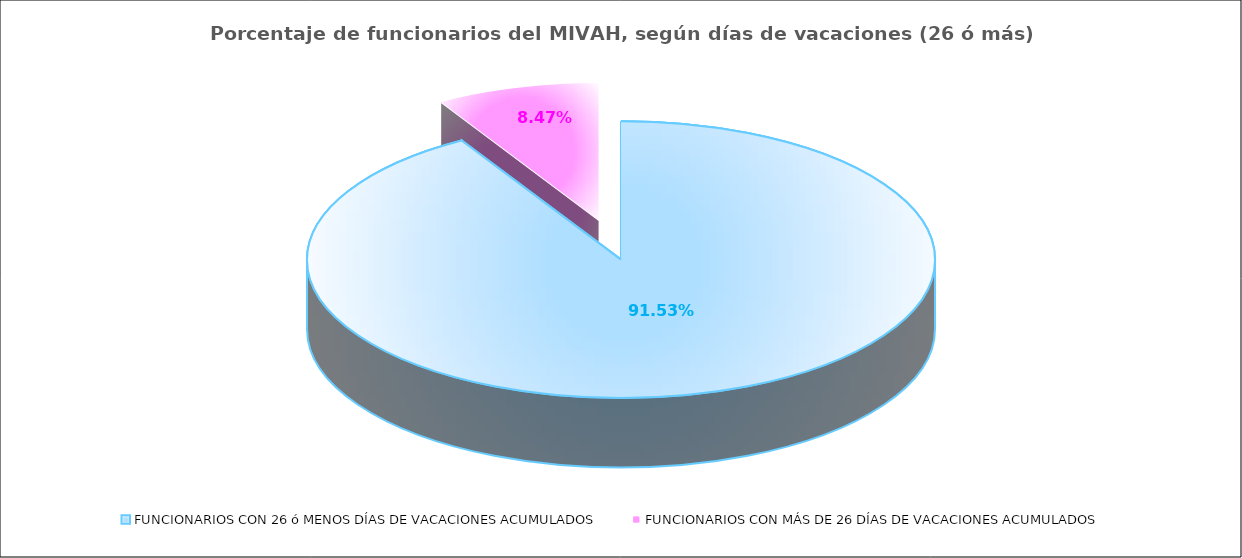
| Category | Series 0 |
|---|---|
| FUNCIONARIOS CON 26 ó MENOS DÍAS DE VACACIONES ACUMULADOS | 0.915 |
| FUNCIONARIOS CON MÁS DE 26 DÍAS DE VACACIONES ACUMULADOS | 0.085 |